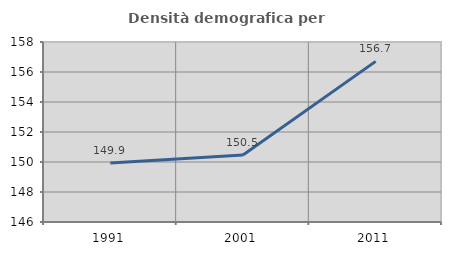
| Category | Densità demografica |
|---|---|
| 1991.0 | 149.926 |
| 2001.0 | 150.466 |
| 2011.0 | 156.708 |